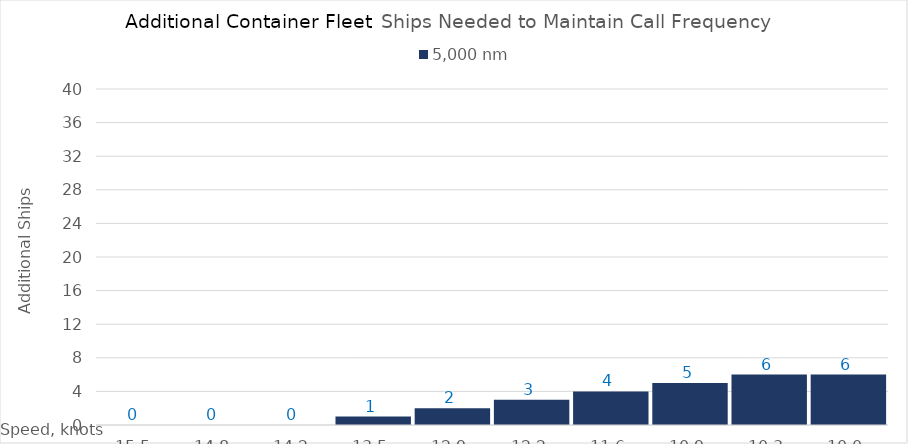
| Category | 5,000 |
|---|---|
| 15.450000000000001 | 0 |
| 14.8 | 0 |
| 14.15 | 0 |
| 13.5 | 1 |
| 12.85 | 2 |
| 12.2 | 3 |
| 11.549999999999999 | 4 |
| 10.899999999999999 | 5 |
| 10.249999999999998 | 6 |
| 10.0 | 6 |